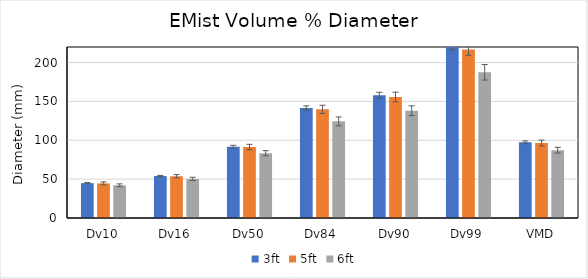
| Category | 3ft | 5ft | 6ft |
|---|---|---|---|
| Dv10 | 44.856 | 44.561 | 42.097 |
| Dv16 | 53.974 | 53.735 | 50.294 |
| Dv50 | 91.792 | 91.252 | 83.383 |
| Dv84 | 141.631 | 139.837 | 124.326 |
| Dv90 | 157.897 | 155.638 | 138.004 |
| Dv99 | 220.813 | 216.858 | 187.446 |
| VMD | 97.392 | 96.462 | 87.222 |